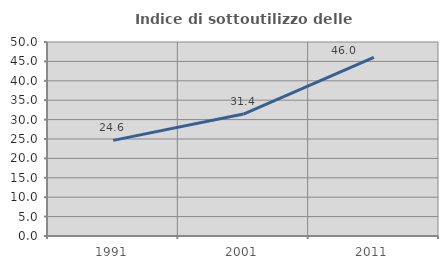
| Category | Indice di sottoutilizzo delle abitazioni  |
|---|---|
| 1991.0 | 24.648 |
| 2001.0 | 31.429 |
| 2011.0 | 46.032 |